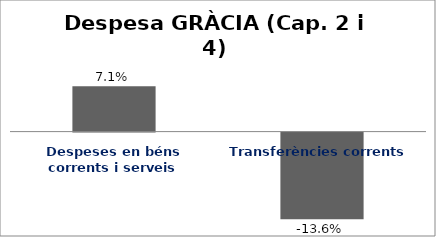
| Category | Series 0 |
|---|---|
| Despeses en béns corrents i serveis | 0.071 |
| Transferències corrents | -0.136 |